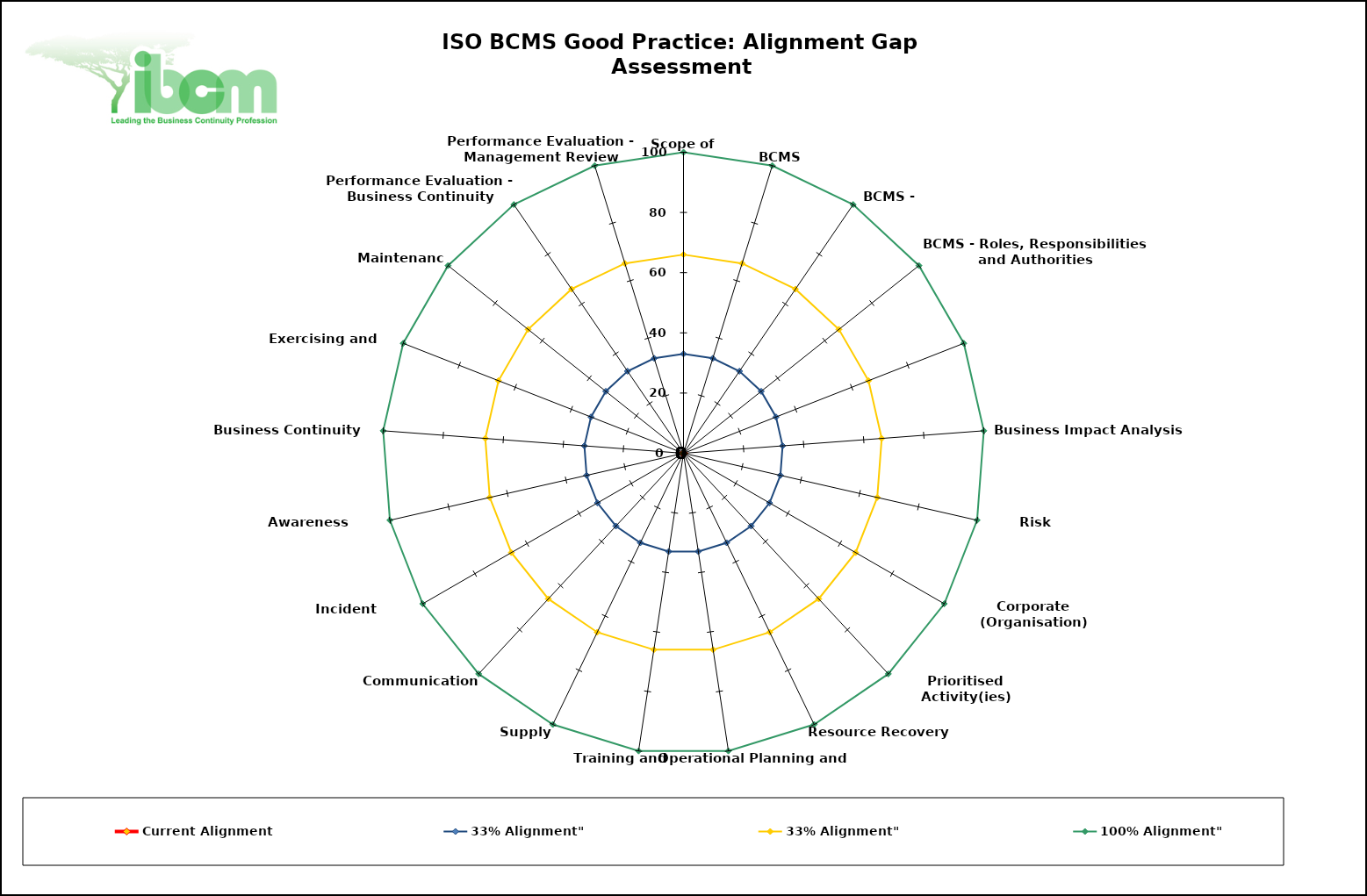
| Category | Current Alignment | 33% Alignment" | 100% Alignment" |
|---|---|---|---|
| Scope of BCMS | 0 | 66 | 100 |
| BCMS | 0 | 66 | 100 |
| BCMS - Policy | 0 | 66 | 100 |
| BCMS - Roles, Responsibilities and Authorities | 0 | 66 | 100 |
|    Assurance | 0 | 66 | 100 |
| Business Impact Analysis (BIA) | 0 | 66 | 100 |
| Risk Assessment | 0 | 66 | 100 |
| Corporate (Organisation)
Strategy | 0 | 66 | 100 |
| Prioritised Activity(ies)
  Recovery Strategy | 0 | 66 | 100 |
|    Resource Recovery Strategy | 0 | 66 | 100 |
|   Operational Planning and Control | 0 | 66 | 100 |
| Training and Competence | 0 | 66 | 100 |
| Supply Chain | 0 | 66 | 100 |
| Communications | 0 | 66 | 100 |
| Incident Management | 0 | 66 | 100 |
| Awareness Programme | 0 | 66 | 100 |
| Business Continuity Plan(s) | 0 | 66 | 100 |
| Exercising and Testing | 0 | 66 | 100 |
| Maintenance | 0 | 66 | 100 |
| Performance Evaluation - Business Continuity Arrangements | 0 | 66 | 100 |
| Performance Evaluation - Management Review | 0 | 66 | 100 |